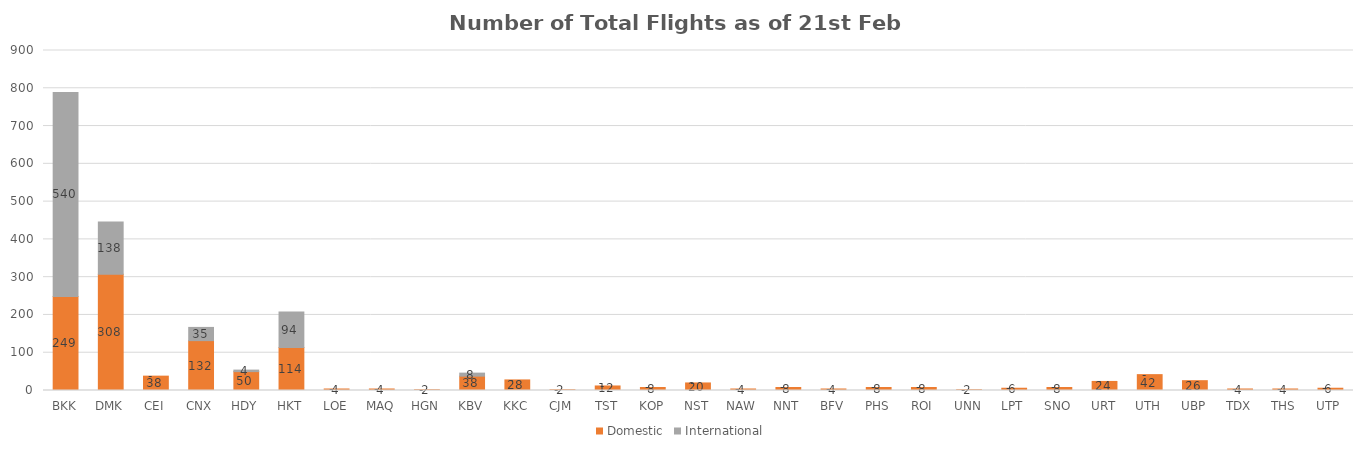
| Category | Domestic | International |
|---|---|---|
| BKK | 249 | 540 |
| DMK | 308 | 138 |
| CEI | 38 | 0 |
| CNX | 132 | 35 |
| HDY | 50 | 4 |
| HKT | 114 | 94 |
| LOE | 4 | 0 |
| MAQ | 4 | 0 |
| HGN | 2 | 0 |
| KBV | 38 | 8 |
| KKC | 28 | 0 |
| CJM | 2 | 0 |
| TST | 12 | 0 |
| KOP | 8 | 0 |
| NST | 20 | 0 |
| NAW | 4 | 0 |
| NNT | 8 | 0 |
| BFV | 4 | 0 |
| PHS | 8 | 0 |
| ROI | 8 | 0 |
| UNN | 2 | 0 |
| LPT | 6 | 0 |
| SNO | 8 | 0 |
| URT | 24 | 0 |
| UTH | 42 | 0 |
| UBP | 26 | 0 |
| TDX | 4 | 0 |
| THS | 4 | 0 |
| UTP | 6 | 0 |